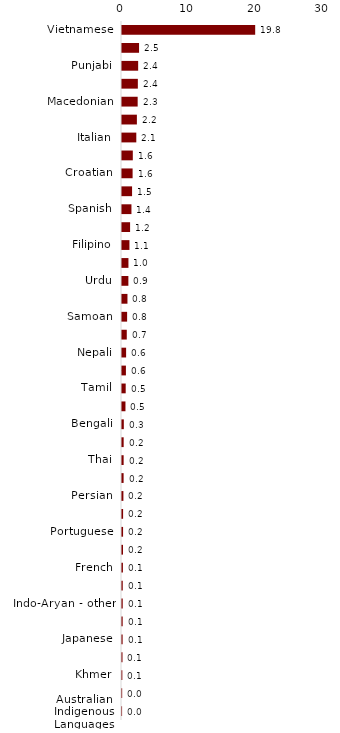
| Category | Series 0 |
|---|---|
| Vietnamese | 19.78 |
| Greek | 2.533 |
| Punjabi | 2.4 |
| Arabic | 2.353 |
| Macedonian | 2.327 |
| Cantonese | 2.21 |
| Italian | 2.124 |
| Tagalog | 1.605 |
| Croatian | 1.575 |
| Mandarin | 1.496 |
| Spanish | 1.403 |
| Turkish | 1.202 |
| Filipino | 1.104 |
| Hindi | 0.957 |
| Urdu | 0.947 |
| Serbian | 0.811 |
| Samoan | 0.761 |
| Chinese Ls other | 0.709 |
| Nepali | 0.611 |
| Polish | 0.582 |
| Tamil | 0.549 |
| Sinhalese | 0.515 |
| Bengali | 0.27 |
| Malayalam | 0.247 |
| Thai | 0.243 |
| Austronesian - Other | 0.238 |
| Persian | 0.208 |
| Indonesian | 0.163 |
| Portuguese | 0.159 |
| German | 0.15 |
| French | 0.137 |
| Russian | 0.111 |
| Indo-Aryan - other | 0.108 |
| Gujarati | 0.1 |
| Japanese | 0.093 |
| Korean | 0.074 |
| Khmer | 0.051 |
| Afrikaans | 0.026 |
| Australian Indigenous Languages | 0.013 |